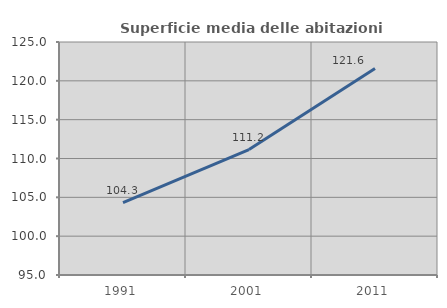
| Category | Superficie media delle abitazioni occupate |
|---|---|
| 1991.0 | 104.331 |
| 2001.0 | 111.155 |
| 2011.0 | 121.583 |